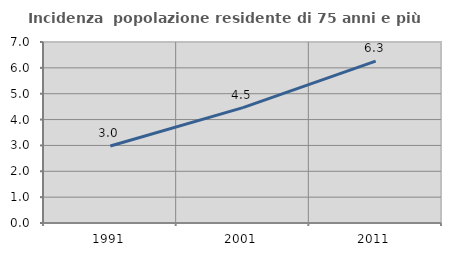
| Category | Incidenza  popolazione residente di 75 anni e più |
|---|---|
| 1991.0 | 2.979 |
| 2001.0 | 4.464 |
| 2011.0 | 6.261 |